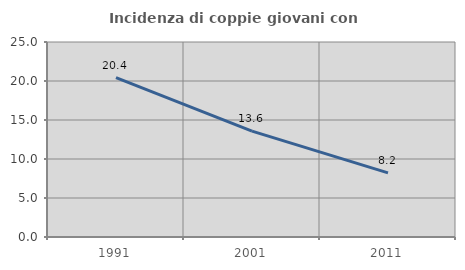
| Category | Incidenza di coppie giovani con figli |
|---|---|
| 1991.0 | 20.432 |
| 2001.0 | 13.575 |
| 2011.0 | 8.223 |